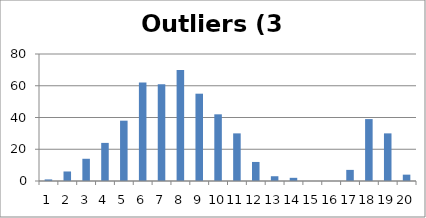
| Category | Outliers (3 dice) |
|---|---|
| 0 | 1 |
| 1 | 6 |
| 2 | 14 |
| 3 | 24 |
| 4 | 38 |
| 5 | 62 |
| 6 | 61 |
| 7 | 70 |
| 8 | 55 |
| 9 | 42 |
| 10 | 30 |
| 11 | 12 |
| 12 | 3 |
| 13 | 2 |
| 14 | 0 |
| 15 | 0 |
| 16 | 7 |
| 17 | 39 |
| 18 | 30 |
| 19 | 4 |